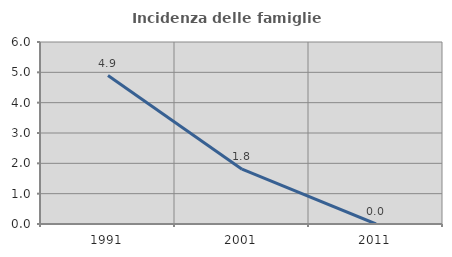
| Category | Incidenza delle famiglie numerose |
|---|---|
| 1991.0 | 4.895 |
| 2001.0 | 1.807 |
| 2011.0 | 0 |